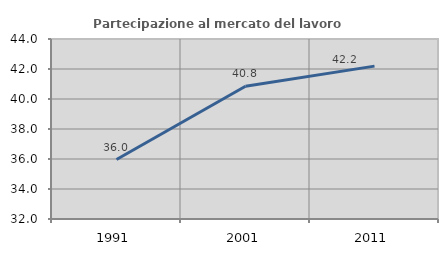
| Category | Partecipazione al mercato del lavoro  femminile |
|---|---|
| 1991.0 | 35.966 |
| 2001.0 | 40.846 |
| 2011.0 | 42.191 |